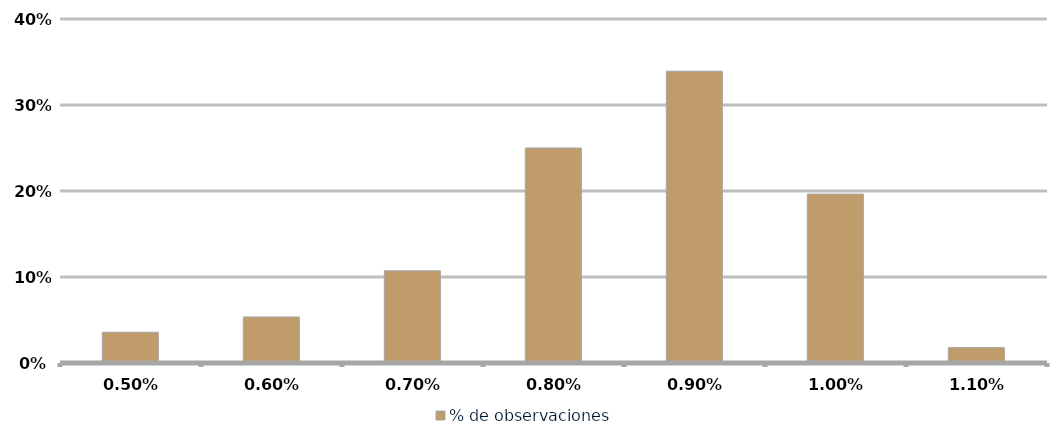
| Category | % de observaciones  |
|---|---|
| 0.005 | 0.036 |
| 0.006 | 0.054 |
| 0.007 | 0.107 |
| 0.008 | 0.25 |
| 0.009 | 0.339 |
| 0.009999999999999998 | 0.196 |
| 0.011 | 0.018 |